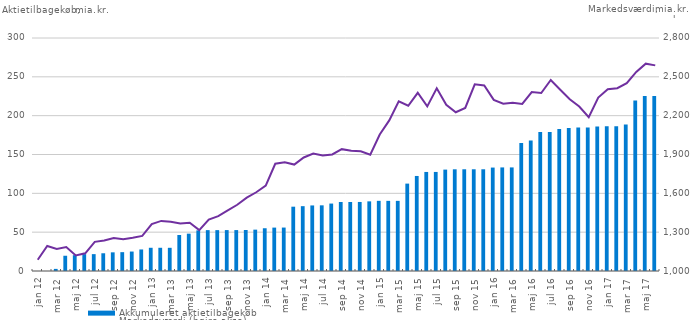
| Category | Akkumuleret aktietilbagekøb  |
|---|---|
| jan 12 | 0.033 |
| feb 12 | 0.007 |
| mar 12 | 2.719 |
| apr 12 | 19.635 |
| maj 12 | 20.368 |
| jun 12 | 21.713 |
| jul 12 | 21.713 |
| aug 12 | 22.829 |
| sep 12 | 24.023 |
| okt 12 | 24.256 |
| nov 12 | 25.045 |
| dec 12 | 27.74 |
| jan 13 | 29.903 |
| feb 13 | 29.902 |
| mar 13 | 29.873 |
| apr 13 | 46.351 |
| maj 13 | 48.081 |
| jun 13 | 52.327 |
| jul 13 | 52.628 |
| aug 13 | 52.628 |
| sep 13 | 52.68 |
| okt 13 | 52.68 |
| nov 13 | 52.827 |
| dec 13 | 53.235 |
| jan 14 | 55.044 |
| feb 14 | 55.877 |
| mar 14 | 55.929 |
| apr 14 | 82.805 |
| maj 14 | 83.473 |
| jun 14 | 84.411 |
| jul 14 | 84.548 |
| aug 14 | 86.836 |
| sep 14 | 88.873 |
| okt 14 | 88.873 |
| nov 14 | 88.895 |
| dec 14 | 89.665 |
| jan 15 | 90.347 |
| feb 15 | 90.311 |
| mar 15 | 90.311 |
| apr 15 | 112.526 |
| maj 15 | 122.366 |
| jun 15 | 127.532 |
| jul 15 | 127.549 |
| aug 15 | 130.56 |
| sep 15 | 130.949 |
| okt 15 | 130.979 |
| nov 15 | 130.979 |
| dec 15 | 130.979 |
| jan 16 | 133.176 |
| feb 16 | 133.369 |
| mar 16 | 133.371 |
| apr 16 | 164.815 |
| maj 16 | 168.167 |
| jun 16 | 178.846 |
| jul 16 | 179.085 |
| aug 16 | 182.98 |
| sep 16 | 184.163 |
| okt 16 | 184.821 |
| nov 16 | 184.795 |
| dec 16 | 185.962 |
| jan 17 | 186.243 |
| feb 17 | 186.243 |
| mar 17 | 188.702 |
| apr 17 | 219.586 |
| maj 17 | 225.302 |
| jun 17 | 225.405 |